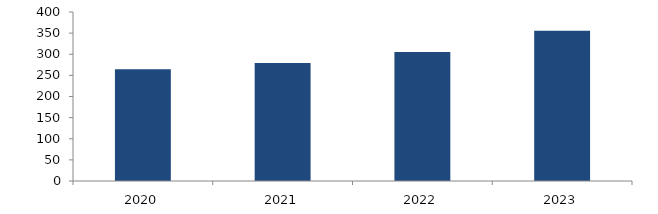
| Category | Bogotá |
|---|---|
| 2020.0 | 264.301 |
| 2021.0 | 279.392 |
| 2022.0 | 305.544 |
| 2023.0 | 355.589 |